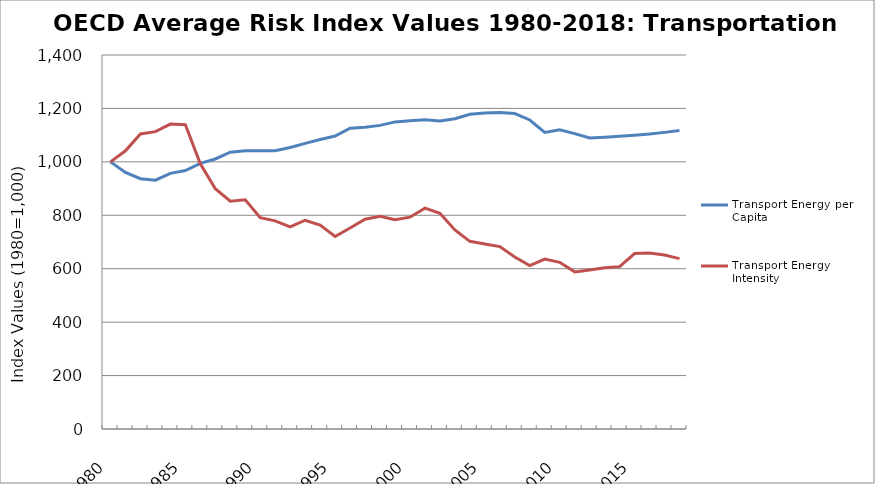
| Category | Transport Energy per Capita | Transport Energy Intensity |
|---|---|---|
| 1980.0 | 1000 | 1000 |
| 1981.0 | 960.151 | 1041.3 |
| 1982.0 | 936.82 | 1104.353 |
| 1983.0 | 931.411 | 1113.105 |
| 1984.0 | 956.902 | 1141.512 |
| 1985.0 | 967.625 | 1138.826 |
| 1986.0 | 994.285 | 992.639 |
| 1987.0 | 1010.754 | 899.321 |
| 1988.0 | 1036.251 | 852.967 |
| 1989.0 | 1041.384 | 858.13 |
| 1990.0 | 1041.436 | 791.259 |
| 1991.0 | 1041.913 | 779 |
| 1992.0 | 1054.037 | 756.344 |
| 1993.0 | 1069.283 | 781.397 |
| 1994.0 | 1083.75 | 762.992 |
| 1995.0 | 1096.831 | 720.649 |
| 1996.0 | 1125.788 | 752.495 |
| 1997.0 | 1129.303 | 785.497 |
| 1998.0 | 1136.559 | 796.573 |
| 1999.0 | 1149.575 | 783.51 |
| 2000.0 | 1153.863 | 792.9 |
| 2001.0 | 1157.836 | 826.595 |
| 2002.0 | 1153.226 | 807.287 |
| 2003.0 | 1161.155 | 744.89 |
| 2004.0 | 1178.14 | 702.512 |
| 2005.0 | 1182.55 | 692.652 |
| 2006.0 | 1184.649 | 682.82 |
| 2007.0 | 1180.745 | 643.835 |
| 2008.0 | 1156.789 | 611.841 |
| 2009.0 | 1110.188 | 636.27 |
| 2010.0 | 1120.103 | 623.947 |
| 2011.0 | 1105.705 | 588.196 |
| 2012.0 | 1089.402 | 595.133 |
| 2013.0 | 1092.409 | 603.258 |
| 2014.0 | 1095.745 | 607.822 |
| 2015.0 | 1099.816 | 656.916 |
| 2016.0 | 1104.426 | 658.541 |
| 2017.0 | 1110.353 | 651.271 |
| 2018.0 | 1117.06 | 637.817 |